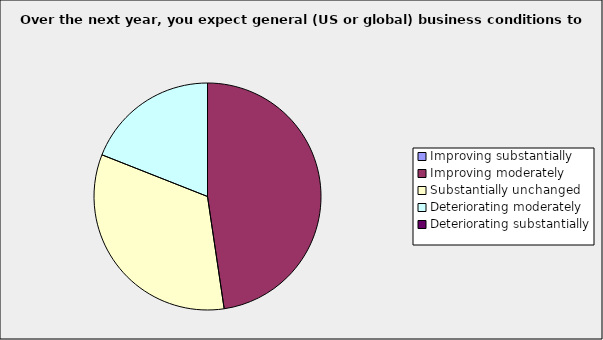
| Category | Series 0 |
|---|---|
| Improving substantially | 0 |
| Improving moderately | 0.476 |
| Substantially unchanged | 0.333 |
| Deteriorating moderately | 0.19 |
| Deteriorating substantially | 0 |